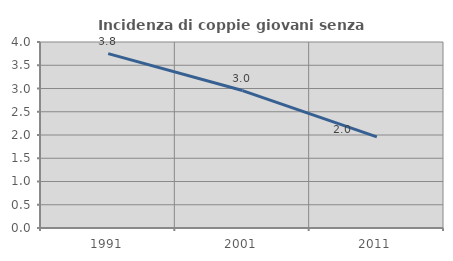
| Category | Incidenza di coppie giovani senza figli |
|---|---|
| 1991.0 | 3.75 |
| 2001.0 | 2.956 |
| 2011.0 | 1.959 |